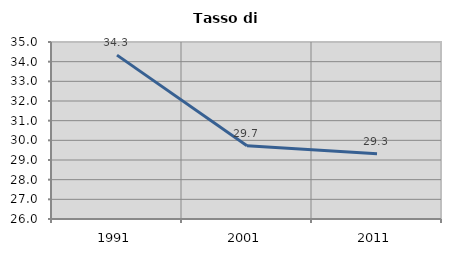
| Category | Tasso di disoccupazione   |
|---|---|
| 1991.0 | 34.333 |
| 2001.0 | 29.721 |
| 2011.0 | 29.321 |